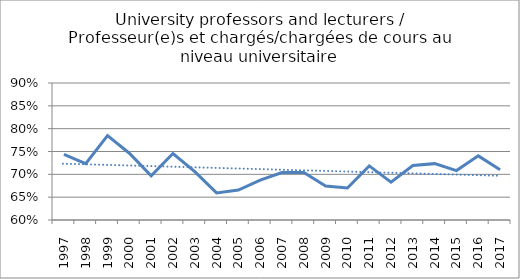
| Category | Series 0 |
|---|---|
| 1997.0 | 0.744 |
| 1998.0 | 0.723 |
| 1999.0 | 0.785 |
| 2000.0 | 0.746 |
| 2001.0 | 0.697 |
| 2002.0 | 0.745 |
| 2003.0 | 0.706 |
| 2004.0 | 0.659 |
| 2005.0 | 0.665 |
| 2006.0 | 0.687 |
| 2007.0 | 0.704 |
| 2008.0 | 0.704 |
| 2009.0 | 0.674 |
| 2010.0 | 0.67 |
| 2011.0 | 0.719 |
| 2012.0 | 0.683 |
| 2013.0 | 0.719 |
| 2014.0 | 0.723 |
| 2015.0 | 0.708 |
| 2016.0 | 0.74 |
| 2017.0 | 0.71 |